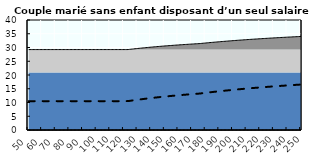
| Category | Coin fiscal moyen (somme des composantes) | Taux moyen d'imposition net en % du salaire brut |
|---|---|---|
| 50.0 | 29.249 | 10.5 |
| 51.0 | 29.249 | 10.5 |
| 52.0 | 29.249 | 10.5 |
| 53.0 | 29.249 | 10.5 |
| 54.0 | 29.249 | 10.5 |
| 55.0 | 29.249 | 10.5 |
| 56.0 | 29.249 | 10.5 |
| 57.0 | 29.249 | 10.5 |
| 58.0 | 29.249 | 10.5 |
| 59.0 | 29.249 | 10.5 |
| 60.0 | 29.249 | 10.5 |
| 61.0 | 29.249 | 10.5 |
| 62.0 | 29.249 | 10.5 |
| 63.0 | 29.249 | 10.5 |
| 64.0 | 29.249 | 10.5 |
| 65.0 | 29.249 | 10.5 |
| 66.0 | 29.249 | 10.5 |
| 67.0 | 29.249 | 10.5 |
| 68.0 | 29.249 | 10.5 |
| 69.0 | 29.249 | 10.5 |
| 70.0 | 29.249 | 10.5 |
| 71.0 | 29.249 | 10.5 |
| 72.0 | 29.249 | 10.5 |
| 73.0 | 29.249 | 10.5 |
| 74.0 | 29.249 | 10.5 |
| 75.0 | 29.249 | 10.5 |
| 76.0 | 29.249 | 10.5 |
| 77.0 | 29.249 | 10.5 |
| 78.0 | 29.249 | 10.5 |
| 79.0 | 29.249 | 10.5 |
| 80.0 | 29.249 | 10.5 |
| 81.0 | 29.249 | 10.5 |
| 82.0 | 29.249 | 10.5 |
| 83.0 | 29.249 | 10.5 |
| 84.0 | 29.249 | 10.5 |
| 85.0 | 29.249 | 10.5 |
| 86.0 | 29.249 | 10.5 |
| 87.0 | 29.249 | 10.5 |
| 88.0 | 29.249 | 10.5 |
| 89.0 | 29.249 | 10.5 |
| 90.0 | 29.249 | 10.5 |
| 91.0 | 29.249 | 10.5 |
| 92.0 | 29.249 | 10.5 |
| 93.0 | 29.249 | 10.5 |
| 94.0 | 29.249 | 10.5 |
| 95.0 | 29.249 | 10.5 |
| 96.0 | 29.249 | 10.5 |
| 97.0 | 29.249 | 10.5 |
| 98.0 | 29.249 | 10.5 |
| 99.0 | 29.249 | 10.5 |
| 100.0 | 29.249 | 10.5 |
| 101.0 | 29.249 | 10.5 |
| 102.0 | 29.249 | 10.5 |
| 103.0 | 29.249 | 10.5 |
| 104.0 | 29.249 | 10.5 |
| 105.0 | 29.249 | 10.5 |
| 106.0 | 29.249 | 10.5 |
| 107.0 | 29.249 | 10.5 |
| 108.0 | 29.249 | 10.5 |
| 109.0 | 29.249 | 10.5 |
| 110.0 | 29.249 | 10.5 |
| 111.0 | 29.249 | 10.5 |
| 112.0 | 29.249 | 10.5 |
| 113.0 | 29.249 | 10.5 |
| 114.0 | 29.249 | 10.5 |
| 115.0 | 29.249 | 10.5 |
| 116.0 | 29.249 | 10.5 |
| 117.0 | 29.249 | 10.5 |
| 118.0 | 29.249 | 10.5 |
| 119.0 | 29.249 | 10.5 |
| 120.0 | 29.249 | 10.5 |
| 121.0 | 29.249 | 10.5 |
| 122.0 | 29.249 | 10.5 |
| 123.0 | 29.259 | 10.513 |
| 124.0 | 29.318 | 10.587 |
| 125.0 | 29.375 | 10.66 |
| 126.0 | 29.432 | 10.731 |
| 127.0 | 29.487 | 10.802 |
| 128.0 | 29.542 | 10.871 |
| 129.0 | 29.596 | 10.939 |
| 130.0 | 29.649 | 11.006 |
| 131.0 | 29.702 | 11.073 |
| 132.0 | 29.753 | 11.138 |
| 133.0 | 29.804 | 11.202 |
| 134.0 | 29.854 | 11.265 |
| 135.0 | 29.903 | 11.328 |
| 136.0 | 29.952 | 11.389 |
| 137.0 | 30 | 11.45 |
| 138.0 | 30.047 | 11.509 |
| 139.0 | 30.093 | 11.568 |
| 140.0 | 30.139 | 11.626 |
| 141.0 | 30.184 | 11.683 |
| 142.0 | 30.229 | 11.739 |
| 143.0 | 30.273 | 11.795 |
| 144.0 | 30.316 | 11.85 |
| 145.0 | 30.359 | 11.904 |
| 146.0 | 30.401 | 11.957 |
| 147.0 | 30.442 | 12.009 |
| 148.0 | 30.483 | 12.061 |
| 149.0 | 30.524 | 12.112 |
| 150.0 | 30.563 | 12.163 |
| 151.0 | 30.603 | 12.212 |
| 152.0 | 30.642 | 12.262 |
| 153.0 | 30.68 | 12.31 |
| 154.0 | 30.718 | 12.358 |
| 155.0 | 30.755 | 12.405 |
| 156.0 | 30.792 | 12.452 |
| 157.0 | 30.828 | 12.498 |
| 158.0 | 30.864 | 12.543 |
| 159.0 | 30.9 | 12.588 |
| 160.0 | 30.935 | 12.632 |
| 161.0 | 30.969 | 12.676 |
| 162.0 | 31.003 | 12.719 |
| 163.0 | 31.037 | 12.762 |
| 164.0 | 31.071 | 12.804 |
| 165.0 | 31.103 | 12.846 |
| 166.0 | 31.136 | 12.887 |
| 167.0 | 31.168 | 12.928 |
| 168.0 | 31.2 | 12.968 |
| 169.0 | 31.231 | 13.008 |
| 170.0 | 31.262 | 13.047 |
| 171.0 | 31.293 | 13.086 |
| 172.0 | 31.323 | 13.124 |
| 173.0 | 31.353 | 13.162 |
| 174.0 | 31.383 | 13.199 |
| 175.0 | 31.412 | 13.236 |
| 176.0 | 31.454 | 13.289 |
| 177.0 | 31.503 | 13.351 |
| 178.0 | 31.551 | 13.412 |
| 179.0 | 31.599 | 13.473 |
| 180.0 | 31.647 | 13.533 |
| 181.0 | 31.693 | 13.592 |
| 182.0 | 31.74 | 13.651 |
| 183.0 | 31.786 | 13.709 |
| 184.0 | 31.831 | 13.766 |
| 185.0 | 31.876 | 13.823 |
| 186.0 | 31.92 | 13.879 |
| 187.0 | 31.964 | 13.935 |
| 188.0 | 32.008 | 13.99 |
| 189.0 | 32.051 | 14.044 |
| 190.0 | 32.093 | 14.098 |
| 191.0 | 32.135 | 14.151 |
| 192.0 | 32.177 | 14.204 |
| 193.0 | 32.218 | 14.256 |
| 194.0 | 32.259 | 14.308 |
| 195.0 | 32.299 | 14.359 |
| 196.0 | 32.339 | 14.409 |
| 197.0 | 32.379 | 14.459 |
| 198.0 | 32.418 | 14.509 |
| 199.0 | 32.457 | 14.558 |
| 200.0 | 32.495 | 14.606 |
| 201.0 | 32.533 | 14.654 |
| 202.0 | 32.571 | 14.702 |
| 203.0 | 32.608 | 14.749 |
| 204.0 | 32.645 | 14.796 |
| 205.0 | 32.681 | 14.842 |
| 206.0 | 32.718 | 14.888 |
| 207.0 | 32.753 | 14.933 |
| 208.0 | 32.789 | 14.978 |
| 209.0 | 32.824 | 15.022 |
| 210.0 | 32.859 | 15.066 |
| 211.0 | 32.893 | 15.11 |
| 212.0 | 32.927 | 15.153 |
| 213.0 | 32.961 | 15.196 |
| 214.0 | 32.995 | 15.238 |
| 215.0 | 33.028 | 15.28 |
| 216.0 | 33.061 | 15.322 |
| 217.0 | 33.093 | 15.363 |
| 218.0 | 33.126 | 15.404 |
| 219.0 | 33.158 | 15.444 |
| 220.0 | 33.189 | 15.485 |
| 221.0 | 33.221 | 15.524 |
| 222.0 | 33.252 | 15.564 |
| 223.0 | 33.283 | 15.603 |
| 224.0 | 33.313 | 15.641 |
| 225.0 | 33.344 | 15.68 |
| 226.0 | 33.374 | 15.718 |
| 227.0 | 33.403 | 15.755 |
| 228.0 | 33.433 | 15.793 |
| 229.0 | 33.462 | 15.83 |
| 230.0 | 33.491 | 15.866 |
| 231.0 | 33.52 | 15.903 |
| 232.0 | 33.548 | 15.939 |
| 233.0 | 33.577 | 15.975 |
| 234.0 | 33.605 | 16.01 |
| 235.0 | 33.633 | 16.045 |
| 236.0 | 33.66 | 16.08 |
| 237.0 | 33.687 | 16.115 |
| 238.0 | 33.714 | 16.149 |
| 239.0 | 33.741 | 16.183 |
| 240.0 | 33.768 | 16.216 |
| 241.0 | 33.794 | 16.25 |
| 242.0 | 33.821 | 16.283 |
| 243.0 | 33.846 | 16.316 |
| 244.0 | 33.872 | 16.348 |
| 245.0 | 33.898 | 16.381 |
| 246.0 | 33.923 | 16.413 |
| 247.0 | 33.948 | 16.445 |
| 248.0 | 33.973 | 16.476 |
| 249.0 | 33.998 | 16.507 |
| 250.0 | 34.022 | 16.538 |